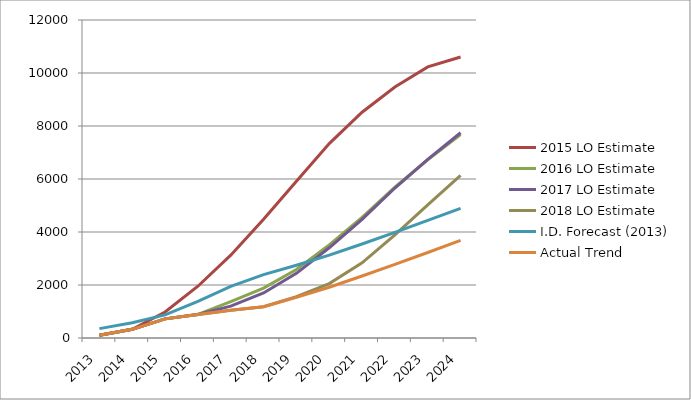
| Category | 2015 LO Estimate | 2016 LO Estimate | 2017 LO Estimate | 2018 LO Estimate | I.D. Forecast (2013) | Actual Trend |
|---|---|---|---|---|---|---|
| 2013.0 | 105 | 105 | 105 | 105 | 353 | 105 |
| 2014.0 | 327 | 327 | 327 | 327 | 573 | 327 |
| 2015.0 | 982 | 722 | 722 | 722 | 874 | 722 |
| 2016.0 | 1954 | 894 | 885 | 885 | 1381 | 885 |
| 2017.0 | 3124 | 1370 | 1203 | 1044 | 1945 | 1044 |
| 2018.0 | 4480 | 1884 | 1698 | 1182 | 2392 | 1182 |
| 2019.0 | 5915 | 2587 | 2441 | 1556 | 2747 | 1537 |
| 2020.0 | 7335 | 3510 | 3404 | 2053 | 3125 | 1915 |
| 2021.0 | 8520 | 4555 | 4474 | 2837 | 3548 | 2338 |
| 2022.0 | 9470 | 5690 | 5659 | 3893 | 3989 | 2779 |
| 2023.0 | 10230 | 6725 | 6744 | 5021 | 4437 | 3227 |
| 2024.0 | 10603 | 7675 | 7744 | 6136 | 4895 | 3685 |